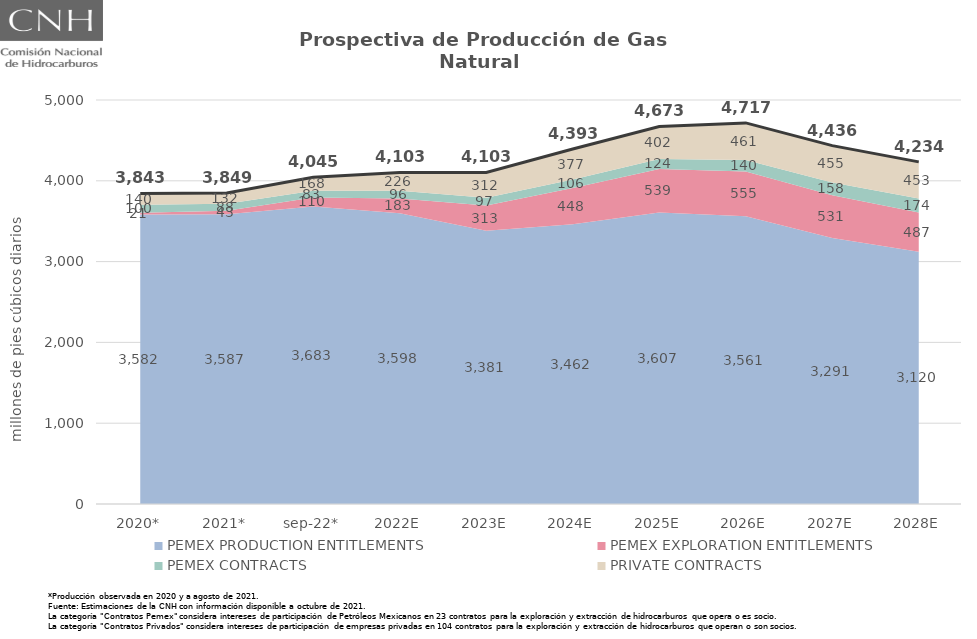
| Category | Total |
|---|---|
| 2020* | 3843.295 |
| 2021* | 3849.174 |
| sep-22* | 4044.539 |
| 2022E | 4103.257 |
| 2023E | 4102.985 |
| 2024E | 4393.187 |
| 2025E | 4672.576 |
| 2026E | 4716.644 |
| 2027E | 4435.521 |
| 2028E | 4234.399 |